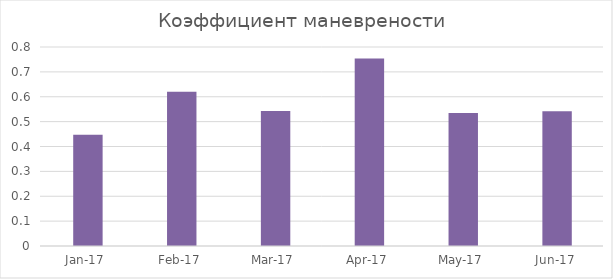
| Category | Коэффициент маневрености  |
|---|---|
| 2017-01-01 | 0.447 |
| 2017-02-01 | 0.62 |
| 2017-03-01 | 0.543 |
| 2017-04-01 | 0.754 |
| 2017-05-01 | 0.535 |
| 2017-06-01 | 0.541 |